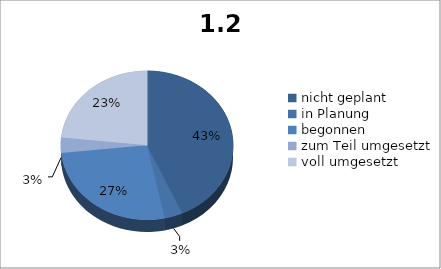
| Category | 1.2 Ablauforganisation  |
|---|---|
| nicht geplant | 13 |
| in Planung | 1 |
| begonnen | 8 |
| zum Teil umgesetzt | 1 |
| voll umgesetzt | 7 |